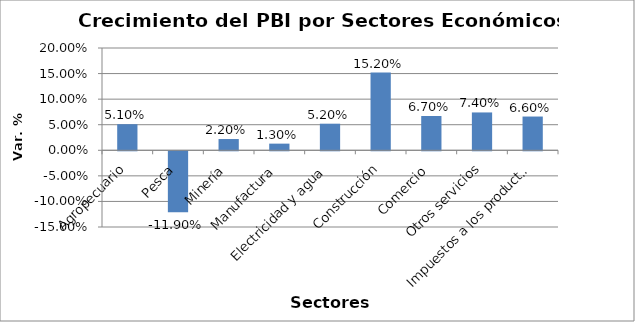
| Category | Series 0 |
|---|---|
| Agropecuario | 0.051 |
| Pesca | -0.119 |
| Minería | 0.022 |
| Manufactura | 0.013 |
| Electricidad y agua | 0.052 |
| Construcción | 0.152 |
| Comercio | 0.067 |
| Otros servicios | 0.074 |
| Impuestos a los productos y derechos de importación | 0.066 |